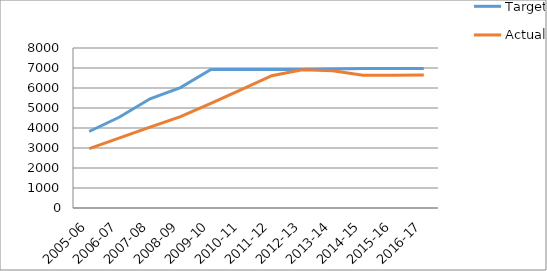
| Category | Target | Actual  |
|---|---|---|
| 2005-06 | 3825 | 2965 |
| 2006-07 | 4549 | 3505 |
| 2007-08 | 5461 | 4041 |
| 2008-09 | 6020 | 4569 |
| 2009-10 | 6923 | 5236 |
| 2010-11 | 6923 | 5922 |
| 2011-12 | 6923 | 6616 |
| 2012-13 | 6923 | 6910 |
| 2013-14 | 6947 | 6858 |
| 2014-15 | 6971 | 6639 |
| 2015-16 | 6971 | 6641 |
| 2016-17 | 6971 | 6650 |